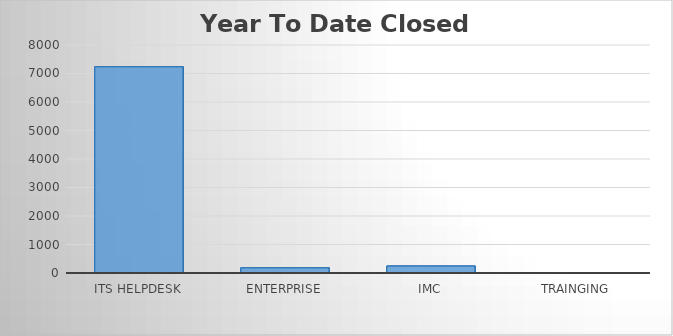
| Category | YTD Closed Tickets |
|---|---|
| 0 | 7237 |
| 1 | 183 |
| 2 | 244 |
| 3 | 16 |